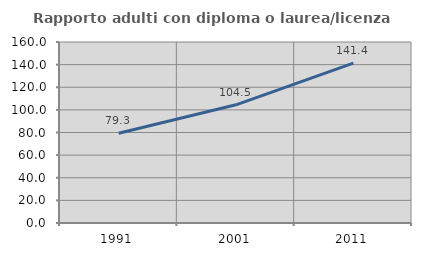
| Category | Rapporto adulti con diploma o laurea/licenza media  |
|---|---|
| 1991.0 | 79.319 |
| 2001.0 | 104.493 |
| 2011.0 | 141.371 |